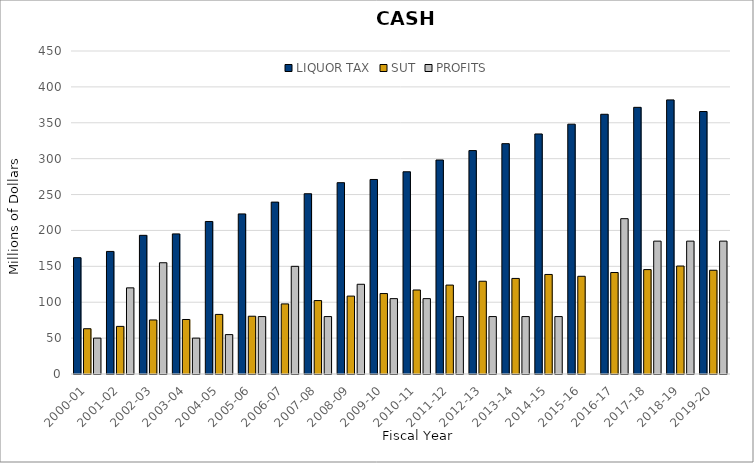
| Category | LIQUOR TAX | SUT | PROFITS |
|---|---|---|---|
| 2000-01 | 162.083 | 63.078 | 50 |
| 2001-02 | 170.769 | 66.332 | 120 |
| 2002-03 | 193.181 | 75.296 | 155 |
| 2003-04 | 195.179 | 75.948 | 50 |
| 2004-05 | 212.501 | 83.015 | 54.9 |
| 2005-06 | 223.036 | 80.487 | 80 |
| 2006-07 | 239.494 | 97.64 | 150 |
| 2007-08 | 251.138 | 102.291 | 80 |
| 2008-09 | 266.54 | 108.524 | 125 |
| 2009-10 | 271.015 | 112.085 | 105 |
| 2010-11 | 281.746 | 117.038 | 105 |
| 2011-12 | 298.144 | 123.869 | 80 |
| 2012-13 | 311.248 | 129.236 | 80 |
| 2013-14 | 320.912 | 133.15 | 80 |
| 2014-15 | 334.414 | 138.687 | 80 |
| 2015-16 | 348.056 | 136.128 | 0 |
| 2016-17 | 361.856 | 141.402 | 216.4 |
| 2017-18 | 371.508 | 145.448 | 185.1 |
| 2018-19 | 381.876 | 150.4 | 185.1 |
| 2019-20 | 365.707 | 144.546 | 185.1 |